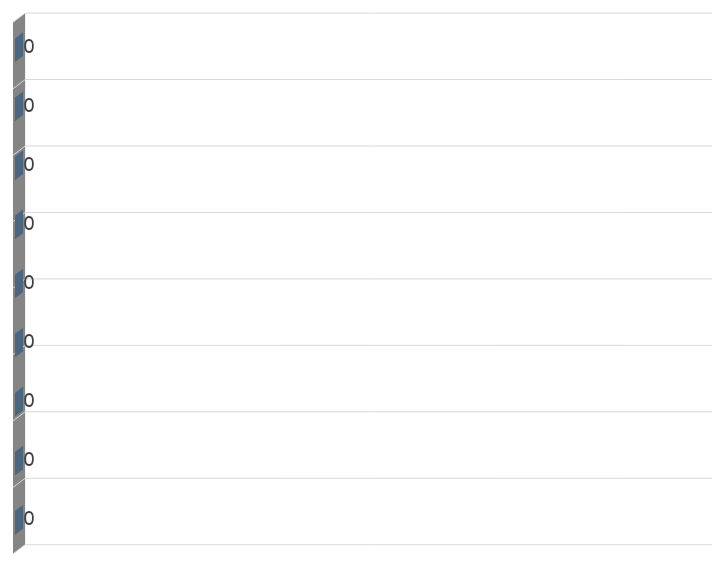
| Category | Series 0 |
|---|---|
| Impulsive | 0 |
| Opportunist | 0 |
| Diplomat | 0 |
| Expert | 0 |
| Achiever | 0 |
| Individualist | 0 |
| Strategist | 0 |
| Alchemist | 0 |
| Ironist | 0 |